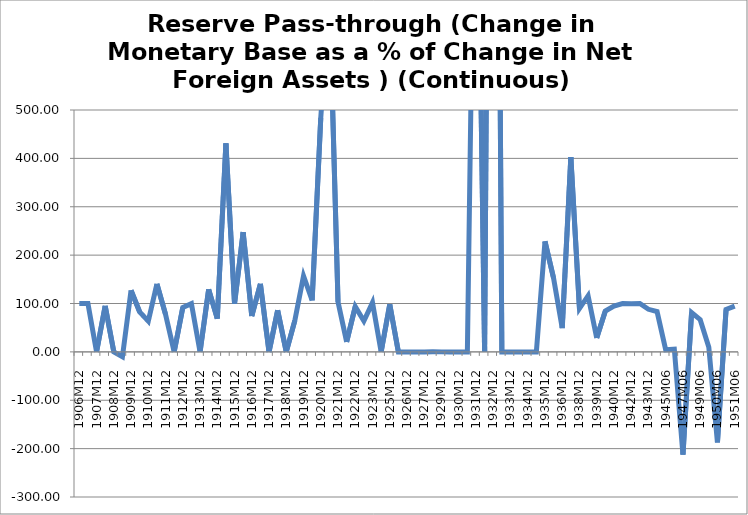
| Category | Reserve Pass-through (Change in Net Foreign Assets as a % of Change in Monetary Base) (Continuous) |
|---|---|
| 1906M12 | 100 |
| 1907M06 | 100 |
| 1907M12 | 0 |
| 1908M06 | 95.049 |
| 1908M12 | 0 |
| 1909M06 | -10.143 |
| 1909M12 | 127.253 |
| 1910M06 | 82.553 |
| 1910M12 | 63.511 |
| 1911M06 | 140.564 |
| 1911M12 | 77.558 |
| 1912M06 | 0 |
| 1912M12 | 91.754 |
| 1913M06 | 99.667 |
| 1913M12 | 0 |
| 1914M06 | 129.129 |
| 1914M12 | 68.796 |
| 1915M06 | 431.206 |
| 1915M12 | 99.336 |
| 1916M06 | 247.46 |
| 1916M12 | 74.031 |
| 1917M06 | 140.507 |
| 1917M12 | 0 |
| 1918M06 | 85.797 |
| 1918M12 | 0 |
| 1919M06 | 65.267 |
| 1919M12 | 156.891 |
| 1920M06 | 106.343 |
| 1920M12 | 483.699 |
| 1921M06 | 744.386 |
| 1921M12 | 103.431 |
| 1922M06 | 20.658 |
| 1922M12 | 93.602 |
| 1923M06 | 63.756 |
| 1923M12 | 101.916 |
| 1925M06 | 0 |
| 1925M12 | 98.161 |
| 1926M06 | 0 |
| 1926M12 | 0 |
| 1927M06 | 0 |
| 1927M12 | 0 |
| 1929M06 | 0.195 |
| 1929M12 | 0 |
| 1930M06 | 0 |
| 1930M12 | 0 |
| 1931M06 | 0 |
| 1931M12 | 1249.357 |
| 1932M06 | 0 |
| 1932M12 | 2735.784 |
| 1933M06 | 0 |
| 1933M12 | 0 |
| 1934M06 | 0 |
| 1934M12 | 0 |
| 1935M06 | 0 |
| 1935M12 | 228.366 |
| 1936M06 | 152.158 |
| 1936M12 | 49.202 |
| 1937M06 | 402.483 |
| 1938M12 | 89.618 |
| 1939M06 | 116.089 |
| 1939M12 | 28.939 |
| 1940M06 | 84.556 |
| 1940M12 | 94.507 |
| 1941M06 | 99.877 |
| 1942M12 | 99.345 |
| 1943M06 | 99.971 |
| 1943M12 | 88.022 |
| 1944M06 | 83.174 |
| 1945M06 | 4.209 |
| 1945M12 | 5.642 |
| 1947M06 | -212.48 |
| 1948M06 | 81.267 |
| 1949M06 | 66.65 |
| 1949M12 | 9.329 |
| 1950M06 | -187.194 |
| 1950M12 | 87.581 |
| 1951M06 | 94.515 |